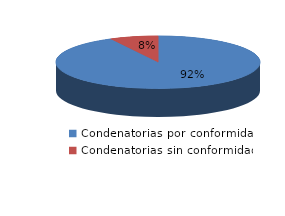
| Category | Series 0 |
|---|---|
| 0 | 24 |
| 1 | 2 |